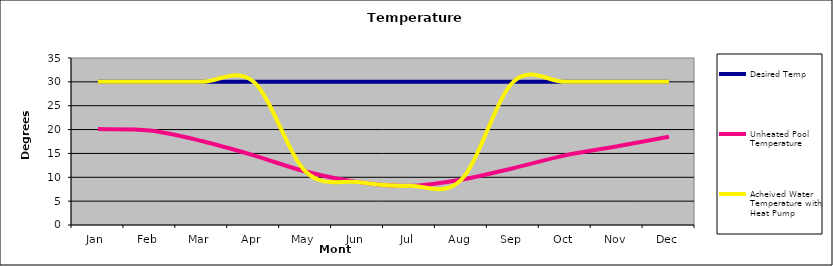
| Category | Desired Temp | Unheated Pool Temperature | Acheived Water Temperature with Heat Pump |
|---|---|---|---|
| Jan | 30 | 20.1 | 30 |
| Feb | 30 | 19.8 | 30 |
| Mar | 30 | 17.6 | 30 |
| Apr | 30 | 14.6 | 30 |
| May | 30 | 11.2 | 11.2 |
| Jun | 30 | 9 | 9 |
| Jul | 30 | 8.2 | 8.2 |
| Aug | 30 | 9.5 | 9.5 |
| Sep | 30 | 11.9 | 30 |
| Oct | 30 | 14.6 | 30 |
| Nov | 30 | 16.5 | 30 |
| Dec | 30 | 18.5 | 30 |